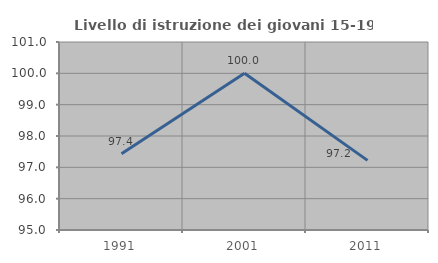
| Category | Livello di istruzione dei giovani 15-19 anni |
|---|---|
| 1991.0 | 97.436 |
| 2001.0 | 100 |
| 2011.0 | 97.222 |